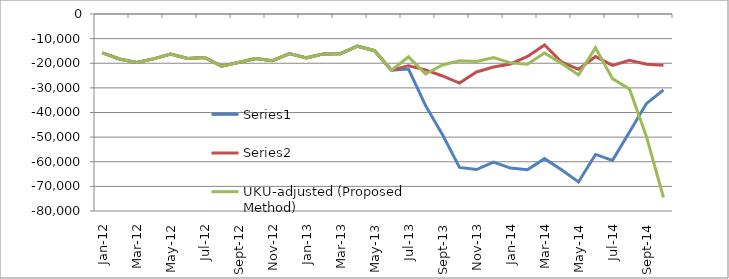
| Category | Series 0 | Series 1 | UKU-adjusted (Proposed Method) |
|---|---|---|---|
| 2012-01-01 | -15758 | -15758 | -15758 |
| 2012-02-01 | -18247 | -18247 | -18247 |
| 2012-03-01 | -19702 | -19702 | -19702 |
| 2012-04-01 | -18218 | -18218 | -18218 |
| 2012-05-01 | -16223 | -16223 | -16223 |
| 2012-06-01 | -18041 | -18041 | -18041 |
| 2012-07-01 | -17648 | -17648 | -17648 |
| 2012-08-01 | -21176 | -21176 | -21176 |
| 2012-09-01 | -19670 | -19670 | -19670 |
| 2012-10-01 | -18125 | -18125 | -18125 |
| 2012-11-01 | -18937 | -18937 | -18937 |
| 2012-12-01 | -16092 | -16092 | -16092 |
| 2013-01-01 | -17801 | -17801 | -17801 |
| 2013-02-01 | -16205 | -16205 | -16205 |
| 2013-03-01 | -16137 | -16137 | -16137 |
| 2013-04-01 | -13079 | -13079 | -13079 |
| 2013-05-01 | -14904 | -14904 | -14904 |
| 2013-06-01 | -22835 | -22835 | -22835 |
| 2013-07-01 | -22354 | -20984.511 | -17401 |
| 2013-08-01 | -37123 | -22676.437 | -24358 |
| 2013-09-01 | -48996 | -25171.311 | -20685 |
| 2013-10-01 | -62296 | -28025.99 | -18958 |
| 2013-11-01 | -63179 | -23533.865 | -19284 |
| 2013-12-01 | -60149 | -21499.69 | -17715.333 |
| 2014-01-01 | -62572 | -20287.356 | -19853.333 |
| 2014-02-01 | -63224 | -17224.893 | -20381.333 |
| 2014-03-01 | -58744 | -12554.675 | -15836.333 |
| 2014-04-01 | -63234 | -19480.062 | -20042.333 |
| 2014-05-01 | -68191 | -22455.549 | -24759.333 |
| 2014-06-01 | -57038 | -17260.99 | -13731.833 |
| 2014-07-01 | -59439 | -20856.993 | -26236.333 |
| 2014-08-01 | -47943 | -18822.13 | -30425.333 |
| 2014-09-01 | -36302 | -20434.829 | -49876.333 |
| 2014-10-01 | -30880 | -20798.127 | -74508.333 |